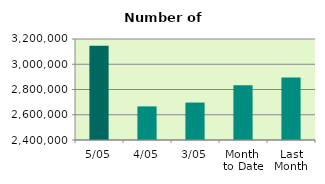
| Category | Series 0 |
|---|---|
| 5/05 | 3145662 |
| 4/05 | 2666226 |
| 3/05 | 2696630 |
| Month 
to Date | 2832934 |
| Last
Month | 2895009.158 |